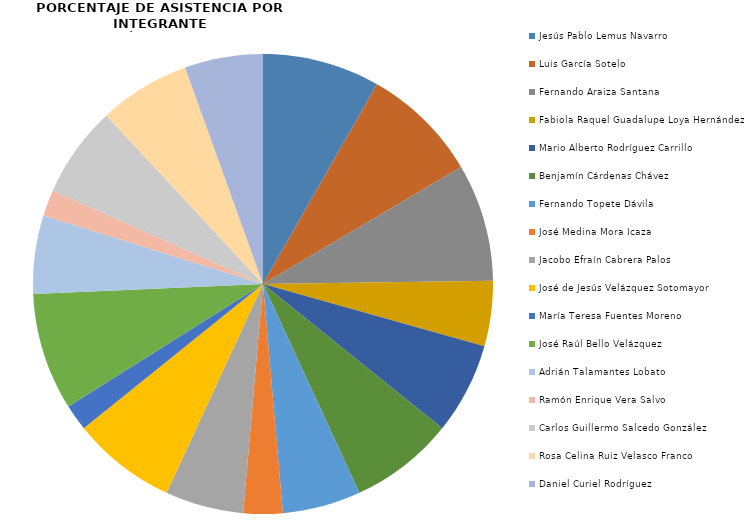
| Category | Series 0 |
|---|---|
| Jesús Pablo Lemus Navarro | 9 |
| Luis García Sotelo | 9 |
| Fernando Araiza Santana | 9 |
| Fabiola Raquel Guadalupe Loya Hernández | 5 |
| Mario Alberto Rodríguez Carrillo | 7 |
| Benjamín Cárdenas Chávez | 8 |
| Fernando Topete Dávila | 6 |
| José Medina Mora Icaza | 3 |
| Jacobo Efraín Cabrera Palos | 6 |
| José de Jesús Velázquez Sotomayor | 8 |
| María Teresa Fuentes Moreno | 2 |
| José Raúl Bello Velázquez | 9 |
| Adrián Talamantes Lobato | 6 |
| Ramón Enrique Vera Salvo | 2 |
| Carlos Guillermo Salcedo González | 7 |
| Rosa Celina Ruiz Velasco Franco | 7 |
| Daniel Curiel Rodríguez | 6 |